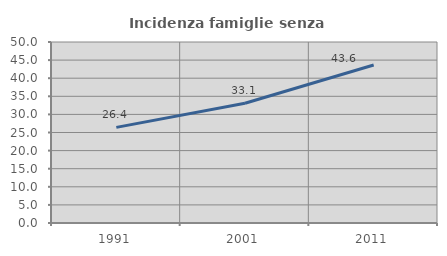
| Category | Incidenza famiglie senza nuclei |
|---|---|
| 1991.0 | 26.415 |
| 2001.0 | 33.067 |
| 2011.0 | 43.631 |